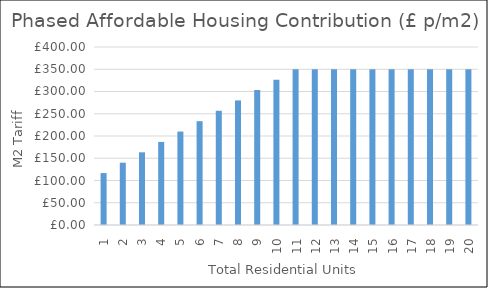
| Category | Series 0 |
|---|---|
| 1.0 | 116.667 |
| 2.0 | 140 |
| 3.0 | 163.333 |
| 4.0 | 186.667 |
| 5.0 | 210 |
| 6.0 | 233.333 |
| 7.0 | 256.667 |
| 8.0 | 280 |
| 9.0 | 303.333 |
| 10.0 | 326.667 |
| 11.0 | 350 |
| 12.0 | 350 |
| 13.0 | 350 |
| 14.0 | 350 |
| 15.0 | 350 |
| 16.0 | 350 |
| 17.0 | 350 |
| 18.0 | 350 |
| 19.0 | 350 |
| 20.0 | 350 |